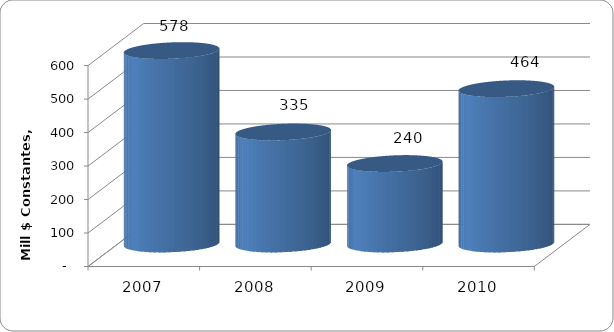
| Category | SALDO DE DEUDA |
|---|---|
| 2007 | 577.854 |
| 2008 | 334.642 |
| 2009 | 240.386 |
| 2010 | 464 |